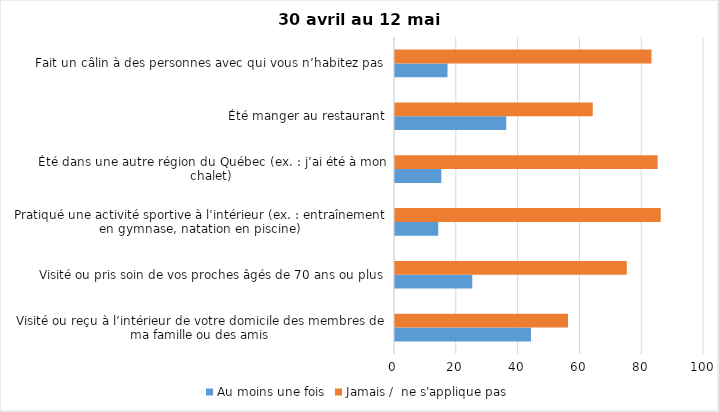
| Category | Au moins une fois | Jamais /  ne s'applique pas |
|---|---|---|
| Visité ou reçu à l’intérieur de votre domicile des membres de ma famille ou des amis | 44 | 56 |
| Visité ou pris soin de vos proches âgés de 70 ans ou plus | 25 | 75 |
| Pratiqué une activité sportive à l’intérieur (ex. : entraînement en gymnase, natation en piscine) | 14 | 86 |
| Été dans une autre région du Québec (ex. : j’ai été à mon chalet) | 15 | 85 |
| Été manger au restaurant | 36 | 64 |
| Fait un câlin à des personnes avec qui vous n’habitez pas | 17 | 83 |